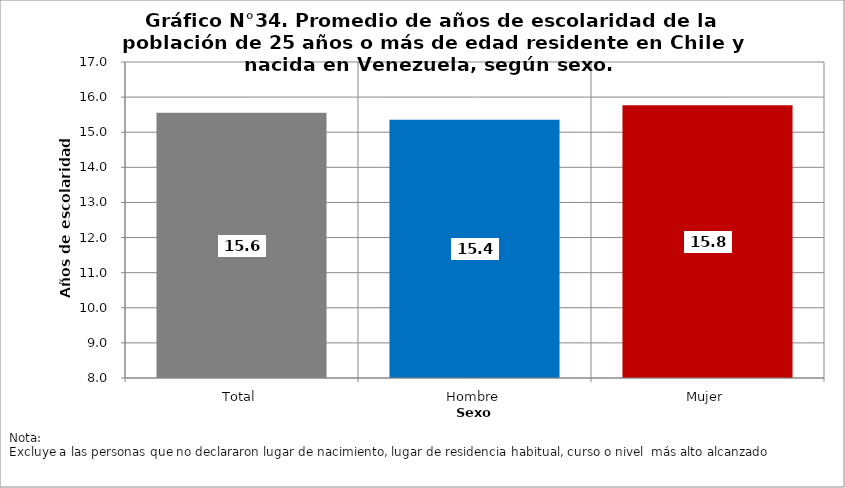
| Category | Series 0 |
|---|---|
| Total | 15.556 |
| Hombre | 15.355 |
| Mujer | 15.772 |